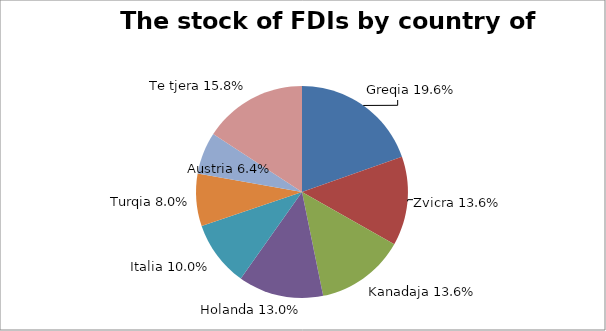
| Category | Share of FDIs |
|---|---|
| Greece  | 0.196 |
| Switzerland | 0.136 |
| Canada  | 0.136 |
| The Netherlands  | 0.13 |
| Italy | 0.1 |
| Turkey | 0.08 |
| Austria | 0.064 |
| Other  | 0.158 |